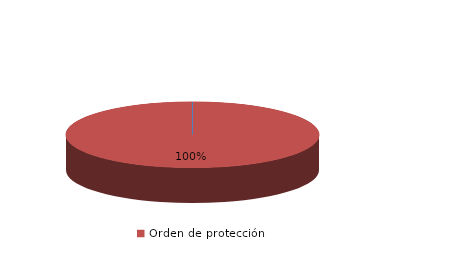
| Category | Series 0 |
|---|---|
| Orden de alejamiento | 0 |
| Orden de protección | 6 |